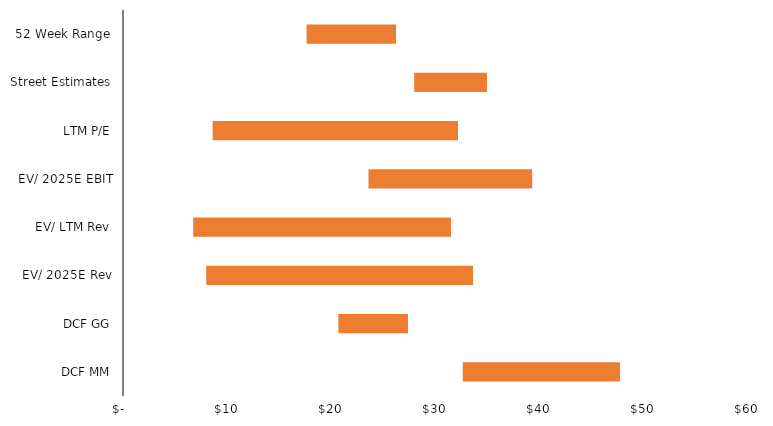
| Category | Q1 | Spread | Average |
|---|---|---|---|
| DCF MM | 32.669 | 15.119 | 47.788 |
| DCF GG | 20.707 | 6.71 | 27.418 |
| EV/ 2025E Rev | 8.005 | 25.676 | 33.682 |
| EV/ LTM Rev | 6.748 | 24.792 | 31.54 |
| EV/ 2025E EBIT | 23.606 | 15.775 | 39.381 |
| LTM P/E | 8.619 | 23.593 | 32.212 |
| Street Estimates | 28 | 7 | 35 |
| 52 Week Range | 17.65 | 8.61 | 26.26 |